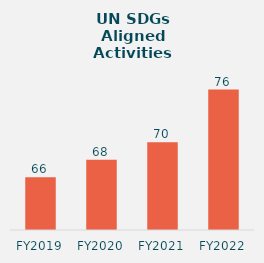
| Category | Series 0 |
|---|---|
| FY2019 | 66 |
| FY2020 | 68 |
| FY2021 | 70 |
| FY2022 | 76 |